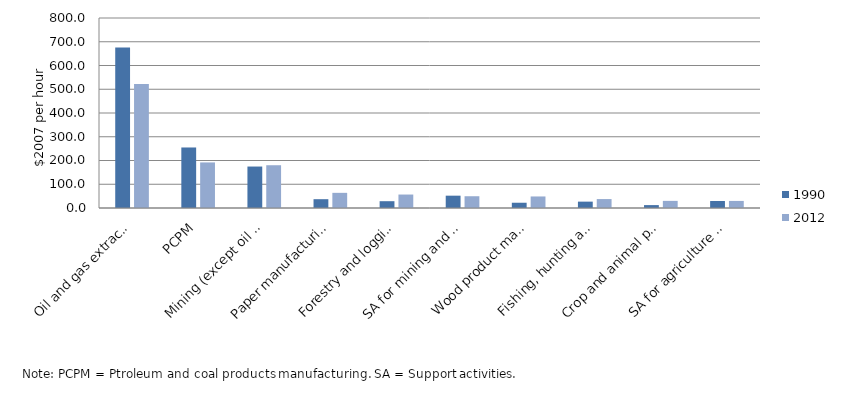
| Category | 1990 | 2012 |
|---|---|---|
| Oil and gas extraction | 675.457 | 521.779 |
| PCPM | 254.836 | 191.863 |
| Mining (except oil and gas) | 174.578 | 180.049 |
| Paper manufacturing | 37.098 | 63.83 |
| Forestry and logging | 28.653 | 56.699 |
| SA for mining and oil and gas | 51.904 | 49.541 |
| Wood product manufacturing | 22.169 | 48.579 |
| Fishing, hunting and trapping | 26.801 | 37.618 |
| Crop and animal production | 12.207 | 29.971 |
| SA for agriculture and forestry | 29.374 | 29.748 |